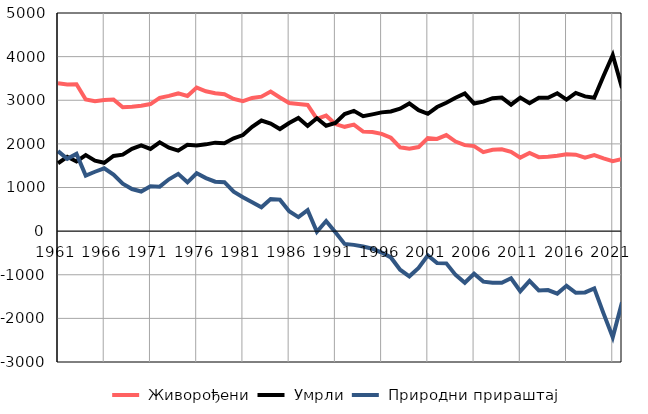
| Category |  Живорођени |  Умрли |  Природни прираштај |
|---|---|---|---|
| 1961.0 | 3389 | 1555 | 1834 |
| 1962.0 | 3361 | 1703 | 1658 |
| 1963.0 | 3368 | 1597 | 1771 |
| 1964.0 | 3016 | 1742 | 1274 |
| 1965.0 | 2976 | 1615 | 1361 |
| 1966.0 | 3008 | 1567 | 1441 |
| 1967.0 | 3016 | 1722 | 1294 |
| 1968.0 | 2841 | 1752 | 1089 |
| 1969.0 | 2853 | 1888 | 965 |
| 1970.0 | 2875 | 1967 | 908 |
| 1971.0 | 2912 | 1883 | 1029 |
| 1972.0 | 3055 | 2035 | 1020 |
| 1973.0 | 3100 | 1912 | 1188 |
| 1974.0 | 3156 | 1844 | 1312 |
| 1975.0 | 3097 | 1978 | 1119 |
| 1976.0 | 3290 | 1964 | 1326 |
| 1977.0 | 3205 | 1989 | 1216 |
| 1978.0 | 3162 | 2028 | 1134 |
| 1979.0 | 3137 | 2016 | 1121 |
| 1980.0 | 3030 | 2127 | 903 |
| 1981.0 | 2977 | 2201 | 776 |
| 1982.0 | 3052 | 2390 | 662 |
| 1983.0 | 3082 | 2536 | 546 |
| 1984.0 | 3199 | 2464 | 735 |
| 1985.0 | 3062 | 2340 | 722 |
| 1986.0 | 2935 | 2478 | 457 |
| 1987.0 | 2916 | 2594 | 322 |
| 1988.0 | 2893 | 2412 | 481 |
| 1989.0 | 2574 | 2587 | -13 |
| 1990.0 | 2647 | 2416 | 231 |
| 1991.0 | 2454 | 2481 | -27 |
| 1992.0 | 2391 | 2684 | -293 |
| 1993.0 | 2441 | 2756 | -315 |
| 1994.0 | 2281 | 2633 | -352 |
| 1995.0 | 2273 | 2677 | -404 |
| 1996.0 | 2231 | 2722 | -491 |
| 1997.0 | 2140 | 2743 | -603 |
| 1998.0 | 1921 | 2806 | -885 |
| 1999.0 | 1891 | 2927 | -1036 |
| 2000.0 | 1927 | 2772 | -845 |
| 2001.0 | 2134 | 2690 | -556 |
| 2002.0 | 2114 | 2845 | -731 |
| 2003.0 | 2202 | 2941 | -739 |
| 2004.0 | 2053 | 3056 | -1003 |
| 2005.0 | 1971 | 3154 | -1183 |
| 2006.0 | 1949 | 2926 | -977 |
| 2007.0 | 1811 | 2969 | -1158 |
| 2008.0 | 1863 | 3046 | -1183 |
| 2009.0 | 1876 | 3062 | -1186 |
| 2010.0 | 1818 | 2899 | -1081 |
| 2011.0 | 1684 | 3061 | -1377 |
| 2012.0 | 1790 | 2931 | -1141 |
| 2013.0 | 1696 | 3055 | -1359 |
| 2014.0 | 1707 | 3057 | -1350 |
| 2015.0 | 1727 | 3159 | -1432 |
| 2016.0 | 1763 | 3016 | -1253 |
| 2017.0 | 1753 | 3167 | -1414 |
| 2018.0 | 1683 | 3088 | -1405 |
| 2019.0 | 1744 | 3056 | -1312 |
| 2020.0 | 1668 | 3554 | -1886 |
| 2021.0 | 1604 | 4036 | -2432 |
| 2022.0 | 1652 | 3284 | -1632 |